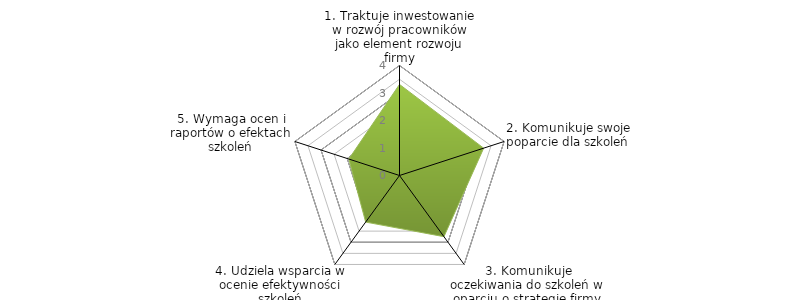
| Category | Series 0 | BENCHMARK |
|---|---|---|
| 1. Traktuje inwestowanie w rozwój pracowników jako element rozwoju firmy |  | 3.312 |
| 2. Komunikuje swoje poparcie dla szkoleń |  | 3.219 |
| 3. Komunikuje oczekiwania do szkoleń w oparciu o strategię firmy |  | 2.75 |
| 4. Udziela wsparcia w ocenie efektywności szkoleń |  | 2.094 |
| 5. Wymaga ocen i raportów o efektach szkoleń |  | 1.938 |